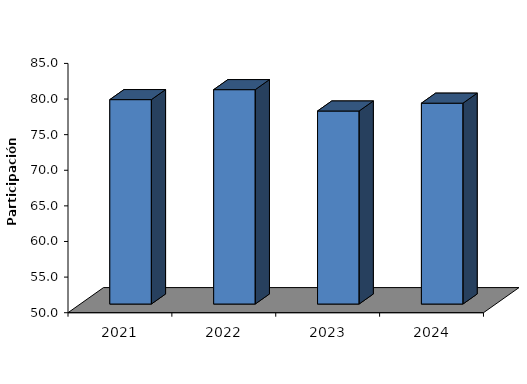
| Category | % Utilización |
|---|---|
| 2021-01-01 | 78.7 |
| 2022-01-01 | 80.1 |
| 2023-01-01 | 77.1 |
| 2024-01-01 | 78.2 |